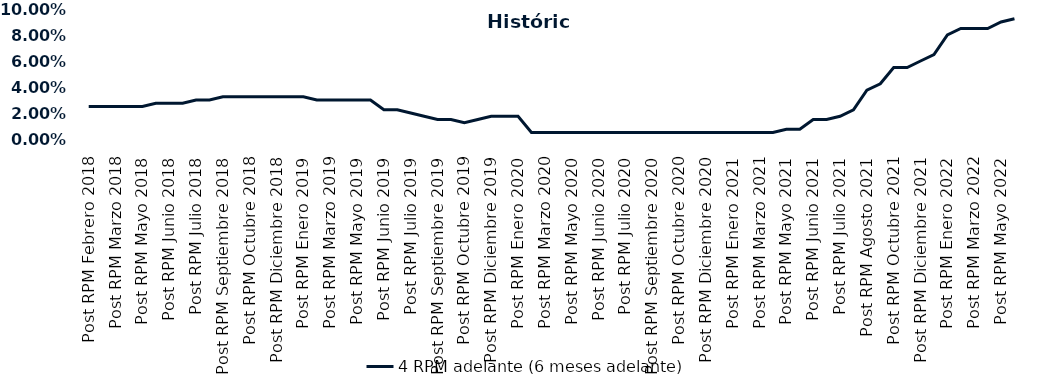
| Category | 4 RPM adelante (6 meses adelante) |
|---|---|
| Post RPM Febrero 2018 | 0.025 |
| Pre RPM Marzo 2018 | 0.025 |
| Post RPM Marzo 2018 | 0.025 |
| Pre RPM Mayo 2018 | 0.025 |
| Post RPM Mayo 2018 | 0.025 |
| Pre RPM Junio 2018 | 0.028 |
| Post RPM Junio 2018 | 0.028 |
| Pre RPM Julio 2018 | 0.028 |
| Post RPM Julio 2018 | 0.03 |
| Pre RPM Septiembre 2018 | 0.03 |
| Post RPM Septiembre 2018 | 0.032 |
| Pre RPM Octubre 2018 | 0.032 |
| Post RPM Octubre 2018 | 0.032 |
| Pre RPM Diciembre 2018 | 0.032 |
| Post RPM Diciembre 2018 | 0.032 |
| Pre RPM Enero 2019 | 0.032 |
| Post RPM Enero 2019 | 0.032 |
| Pre RPM Marzo 2019 | 0.03 |
| Post RPM Marzo 2019 | 0.03 |
| Pre RPM Mayo 2019 | 0.03 |
| Post RPM Mayo 2019 | 0.03 |
| Pre RPM Junio 2019 | 0.03 |
| Post RPM Junio 2019 | 0.022 |
| Pre RPM Julio 2019 | 0.022 |
| Post RPM Julio 2019 | 0.02 |
| Pre RPM Septiembre 2019 | 0.018 |
| Post RPM Septiembre 2019 | 0.015 |
| Pre RPM Octubre 2019 | 0.015 |
| Post RPM Octubre 2019 | 0.012 |
| Pre RPM Diciembre 2019 | 0.015 |
| Post RPM Diciembre 2019 | 0.018 |
| Pre RPM Enero 2020 | 0.018 |
| Post RPM Enero 2020 | 0.018 |
| Pre RPM Marzo 2020 | 0.005 |
| Post RPM Marzo 2020 | 0.005 |
| Pre RPM Mayo 2020 | 0.005 |
| Post RPM Mayo 2020 | 0.005 |
| Pre RPM Junio 2020 | 0.005 |
| Post RPM Junio 2020 | 0.005 |
| Pre RPM Julio 2020 | 0.005 |
| Post RPM Julio 2020 | 0.005 |
| Pre RPM Septiembre 2020 | 0.005 |
| Post RPM Septiembre 2020 | 0.005 |
| Pre RPM Octubre 2020 | 0.005 |
| Post RPM Octubre 2020 | 0.005 |
| Pre RPM Diciembre 2020 | 0.005 |
| Post RPM Diciembre 2020 | 0.005 |
| Pre RPM Enero 2021 | 0.005 |
| Post RPM Enero 2021 | 0.005 |
| Pre RPM Marzo 2021 | 0.005 |
| Post RPM Marzo 2021 | 0.005 |
| Pre RPM Mayo 2021 | 0.005 |
| Post RPM Mayo 2021 | 0.008 |
| Pre RPM Junio 2021 | 0.008 |
| Post RPM Junio 2021 | 0.015 |
| Pre RPM Julio 2021 | 0.015 |
| Post RPM Julio 2021 | 0.018 |
| Pre RPM Agosto 2021 | 0.022 |
| Post RPM Agosto 2021 | 0.038 |
| Pre RPM Octubre 2021 | 0.042 |
| Post RPM Octubre 2021 | 0.055 |
| Pre RPM Diciembre 2021 | 0.055 |
| Post RPM Diciembre 2021 | 0.06 |
| Pre RPM Enero 2022 | 0.065 |
| Post RPM Enero 2022 | 0.08 |
| Pre RPM Marzo 2022 | 0.085 |
| Post RPM Marzo 2022 | 0.085 |
| Pre RPM Mayo 2022 | 0.085 |
| Post RPM Mayo 2022 | 0.09 |
| Pre RPM Junio 2022 | 0.092 |